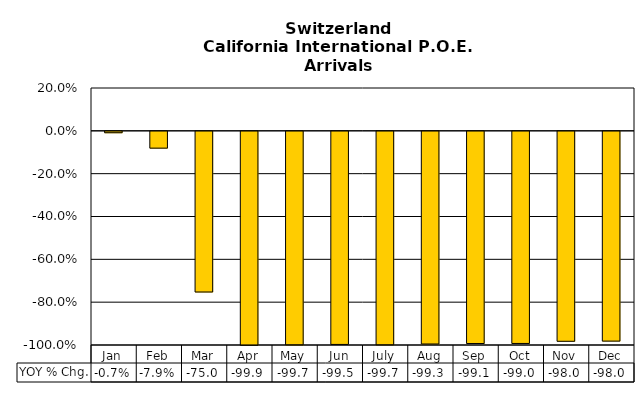
| Category | YOY % Chg. |
|---|---|
| Jan | -0.007 |
| Feb | -0.079 |
| Mar | -0.75 |
| Apr | -0.999 |
| May | -0.997 |
| Jun | -0.995 |
| July | -0.997 |
| Aug | -0.993 |
| Sep | -0.991 |
| Oct | -0.99 |
| Nov | -0.98 |
| Dec | -0.98 |